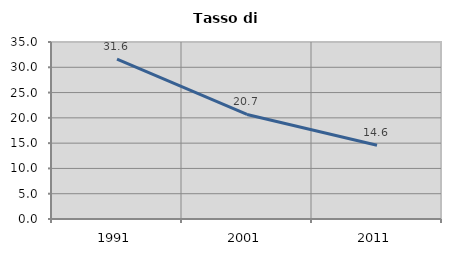
| Category | Tasso di disoccupazione   |
|---|---|
| 1991.0 | 31.611 |
| 2001.0 | 20.674 |
| 2011.0 | 14.58 |